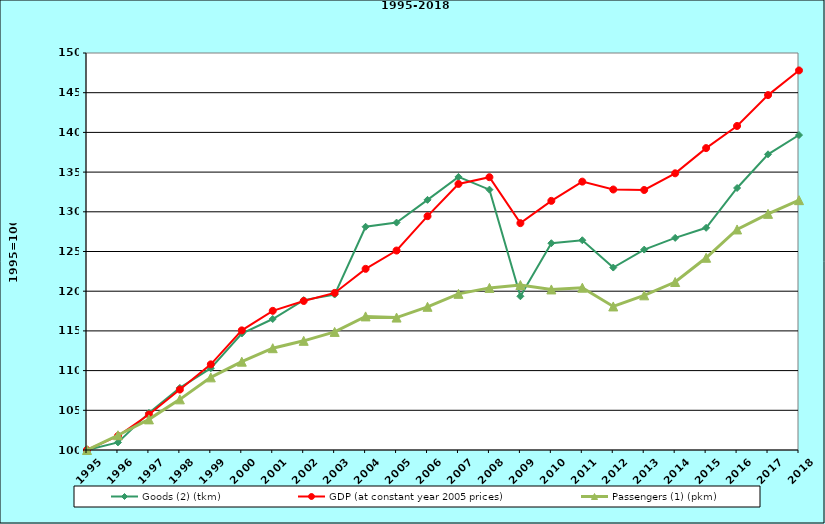
| Category | Goods (2) (tkm) | GDP (at constant year 2005 prices) | Passengers (1) (pkm) |
|---|---|---|---|
| 1995.0 | 100 | 100 | 100 |
| 1996.0 | 100.958 | 101.765 | 101.857 |
| 1997.0 | 104.673 | 104.471 | 103.856 |
| 1998.0 | 107.818 | 107.609 | 106.377 |
| 1999.0 | 110.301 | 110.785 | 109.147 |
| 2000.0 | 114.673 | 115.067 | 111.124 |
| 2001.0 | 116.499 | 117.527 | 112.822 |
| 2002.0 | 118.879 | 118.767 | 113.751 |
| 2003.0 | 119.579 | 119.784 | 114.875 |
| 2004.0 | 128.117 | 122.816 | 116.825 |
| 2005.0 | 128.642 | 125.12 | 116.679 |
| 2006.0 | 131.504 | 129.45 | 118.036 |
| 2007.0 | 134.396 | 133.508 | 119.668 |
| 2008.0 | 132.791 | 134.359 | 120.416 |
| 2009.0 | 119.362 | 128.57 | 120.778 |
| 2010.0 | 126.041 | 131.376 | 120.221 |
| 2011.0 | 126.416 | 133.799 | 120.439 |
| 2012.0 | 122.977 | 132.808 | 118.079 |
| 2013.0 | 125.24 | 132.747 | 119.48 |
| 2014.0 | 126.713 | 134.847 | 121.158 |
| 2015.0 | 127.982 | 138.021 | 124.211 |
| 2016.0 | 132.998 | 140.809 | 127.776 |
| 2017.0 | 137.241 | 144.698 | 129.739 |
| 2018.0 | 139.665 | 147.803 | 131.467 |